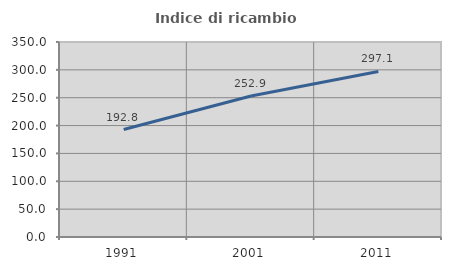
| Category | Indice di ricambio occupazionale  |
|---|---|
| 1991.0 | 192.818 |
| 2001.0 | 252.941 |
| 2011.0 | 297.11 |